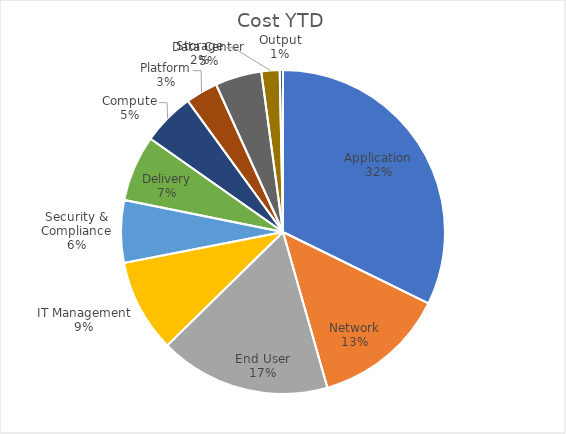
| Category | Cost YTD |
|---|---|
| Application | 404045991.951 |
| Network | 166800504.172 |
| End User | 213992128.422 |
| IT Management | 116250155.883 |
| Security & Compliance | 78043065.528 |
| Delivery | 82484842.642 |
| Compute | 65672530.246 |
| Platform | 40337982.548 |
| Data Center | 58026289.552 |
| Storage | 22823258.84 |
| Output | 4073170.232 |